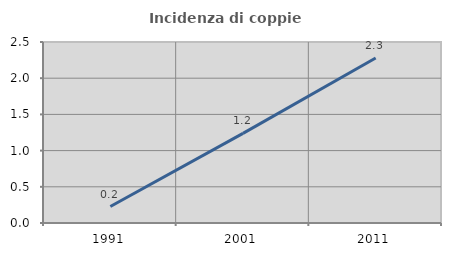
| Category | Incidenza di coppie miste |
|---|---|
| 1991.0 | 0.228 |
| 2001.0 | 1.238 |
| 2011.0 | 2.278 |